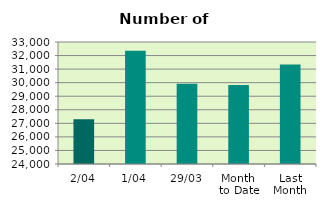
| Category | Series 0 |
|---|---|
| 2/04 | 27294 |
| 1/04 | 32352 |
| 29/03 | 29924 |
| Month 
to Date | 29823 |
| Last
Month | 31344.095 |